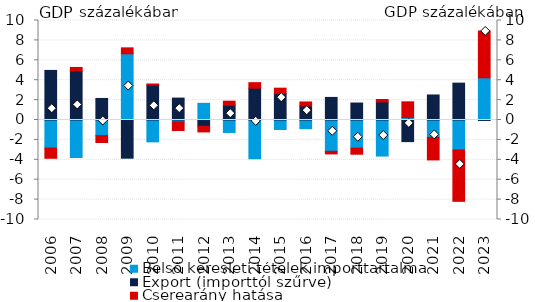
| Category | Belső keresleti tételek importtartalma | Export (importtól szűrve) | Cserearány hatása |
|---|---|---|---|
| 2006.0 | -2.818 | 4.983 | -1.03 |
| 2007.0 | -3.772 | 4.944 | 0.337 |
| 2008.0 | -1.569 | 2.164 | -0.692 |
| 2009.0 | 6.651 | -3.839 | 0.599 |
| 2010.0 | -2.196 | 3.504 | 0.114 |
| 2011.0 | -0.179 | 2.202 | -0.876 |
| 2012.0 | 1.676 | -0.635 | -0.562 |
| 2013.0 | -1.252 | 1.481 | 0.409 |
| 2014.0 | -3.891 | 3.198 | 0.554 |
| 2015.0 | -0.957 | 2.649 | 0.55 |
| 2016.0 | -0.874 | 1.415 | 0.397 |
| 2017.0 | -3.149 | 2.27 | -0.259 |
| 2018.0 | -2.828 | 1.706 | -0.612 |
| 2019.0 | -3.622 | 1.819 | 0.243 |
| 2020.0 | 0.243 | -2.171 | 1.584 |
| 2021.0 | -1.739 | 2.515 | -2.273 |
| 2022.0 | -3.013 | 3.705 | -5.162 |
| 2023.0 | 4.238 | -0.044 | 4.707 |